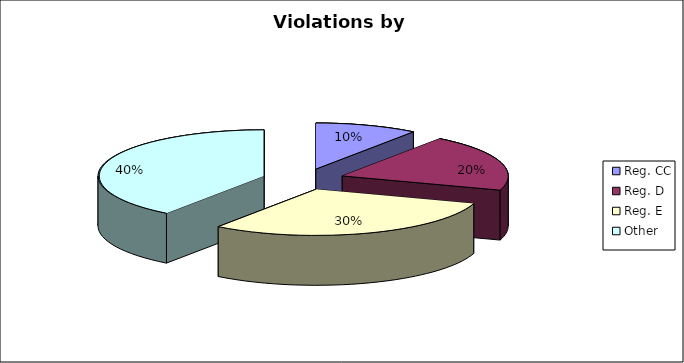
| Category | Series 0 |
|---|---|
| Reg. CC | 1 |
| Reg. D | 2 |
| Reg. E | 3 |
| Other | 4 |